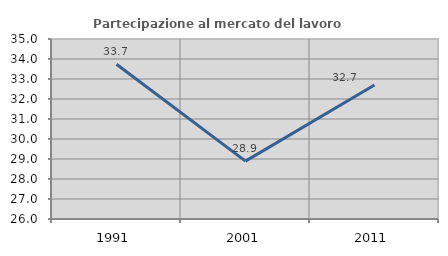
| Category | Partecipazione al mercato del lavoro  femminile |
|---|---|
| 1991.0 | 33.739 |
| 2001.0 | 28.892 |
| 2011.0 | 32.701 |